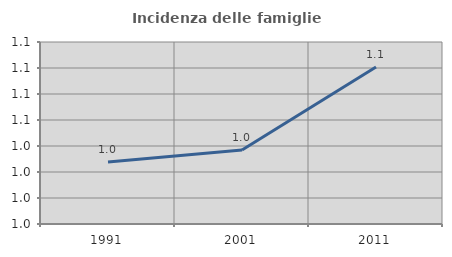
| Category | Incidenza delle famiglie numerose |
|---|---|
| 1991.0 | 1.028 |
| 2001.0 | 1.037 |
| 2011.0 | 1.101 |